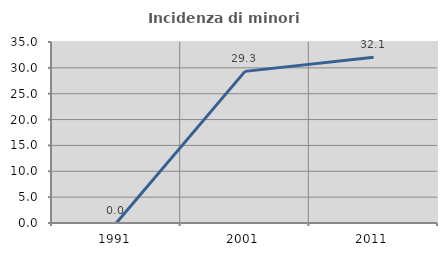
| Category | Incidenza di minori stranieri |
|---|---|
| 1991.0 | 0 |
| 2001.0 | 29.319 |
| 2011.0 | 32.058 |